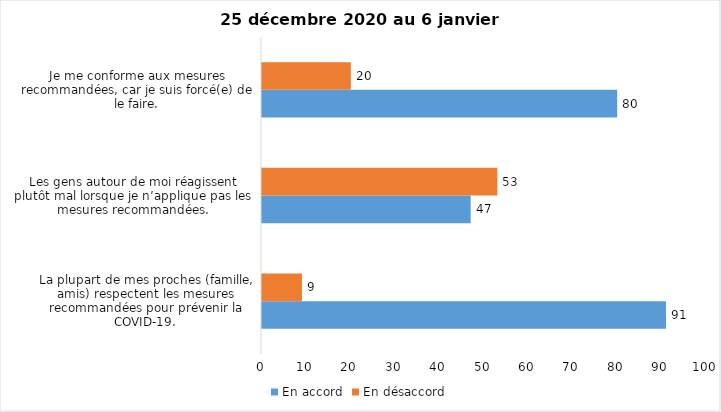
| Category | En accord | En désaccord |
|---|---|---|
| La plupart de mes proches (famille, amis) respectent les mesures recommandées pour prévenir la COVID-19. | 91 | 9 |
| Les gens autour de moi réagissent plutôt mal lorsque je n’applique pas les mesures recommandées. | 47 | 53 |
| Je me conforme aux mesures recommandées, car je suis forcé(e) de le faire. | 80 | 20 |